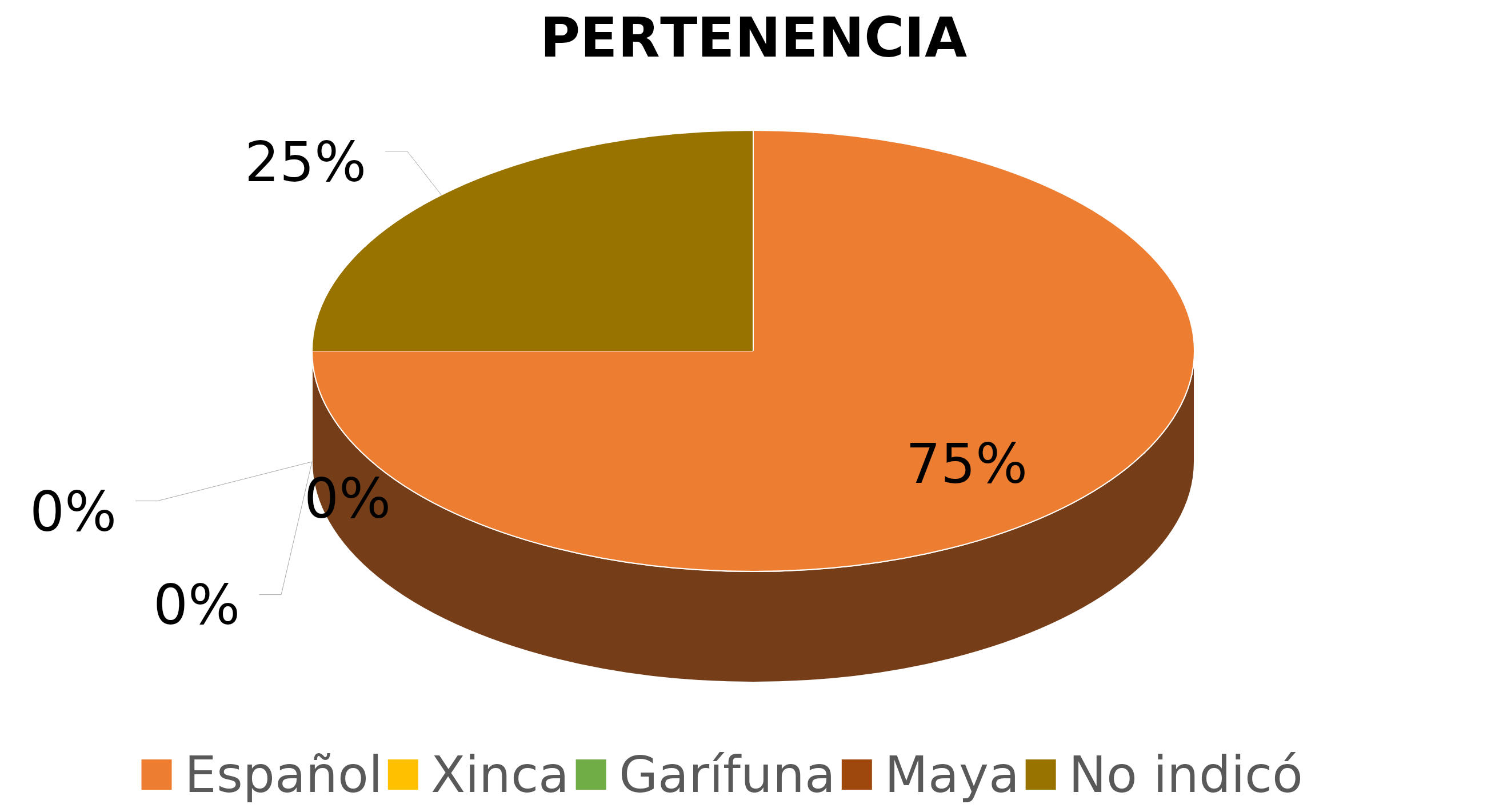
| Category | Series 0 |
|---|---|
| Español | 0.75 |
| Xinca | 0 |
| Garífuna | 0 |
| Maya | 0 |
| No indicó | 0.25 |